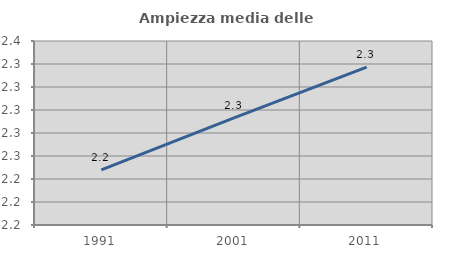
| Category | Ampiezza media delle famiglie |
|---|---|
| 1991.0 | 2.248 |
| 2001.0 | 2.293 |
| 2011.0 | 2.337 |